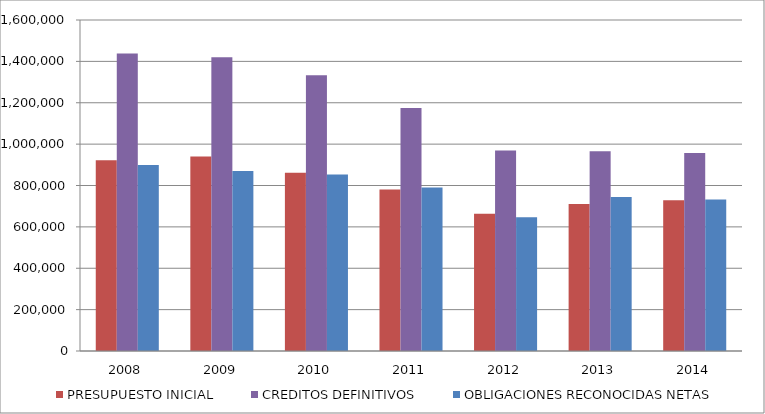
| Category | PRESUPUESTO INICIAL | CREDITOS DEFINITIVOS | OBLIGACIONES RECONOCIDAS NETAS |
|---|---|---|---|
| 2008.0 | 922294.818 | 1438199.99 | 898611.51 |
| 2009.0 | 939676.058 | 1419362.4 | 870419.19 |
| 2010.0 | 861041.347 | 1333148.83 | 853013.717 |
| 2011.0 | 780284.157 | 1174051.878 | 790656.119 |
| 2012.0 | 663839.162 | 969231.971 | 646103.913 |
| 2013.0 | 710893.242 | 965003.591 | 744398.393 |
| 2014.0 | 728748.257 | 956965.337 | 731935.083 |